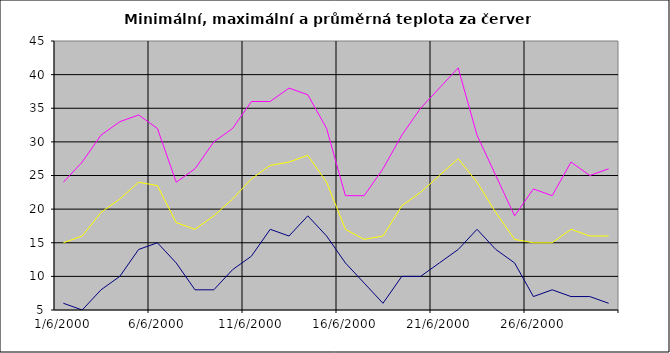
| Category | Series 0 | Series 1 | Series 2 |
|---|---|---|---|
| 2000-06-01 | 6 | 24 | 15 |
| 2000-06-02 | 5 | 27 | 16 |
| 2000-06-03 | 8 | 31 | 19.5 |
| 2000-06-04 | 10 | 33 | 21.5 |
| 2000-06-05 | 14 | 34 | 24 |
| 2000-06-06 | 15 | 32 | 23.5 |
| 2000-06-07 | 12 | 24 | 18 |
| 2000-06-08 | 8 | 26 | 17 |
| 2000-06-09 | 8 | 30 | 19 |
| 2000-06-10 | 11 | 32 | 21.5 |
| 2000-06-11 | 13 | 36 | 24.5 |
| 2000-06-12 | 17 | 36 | 26.5 |
| 2000-06-13 | 16 | 38 | 27 |
| 2000-06-14 | 19 | 37 | 28 |
| 2000-06-15 | 16 | 32 | 24 |
| 2000-06-16 | 12 | 22 | 17 |
| 2000-06-17 | 9 | 22 | 15.5 |
| 2000-06-18 | 6 | 26 | 16 |
| 2000-06-19 | 10 | 31 | 20.5 |
| 2000-06-20 | 10 | 35 | 22.5 |
| 2000-06-21 | 12 | 38 | 25 |
| 2000-06-22 | 14 | 41 | 27.5 |
| 2000-06-23 | 17 | 31 | 24 |
| 2000-06-24 | 14 | 25 | 19.5 |
| 2000-06-25 | 12 | 19 | 15.5 |
| 2000-06-26 | 7 | 23 | 15 |
| 2000-06-27 | 8 | 22 | 15 |
| 2000-06-28 | 7 | 27 | 17 |
| 2000-06-29 | 7 | 25 | 16 |
| 2000-06-30 | 6 | 26 | 16 |